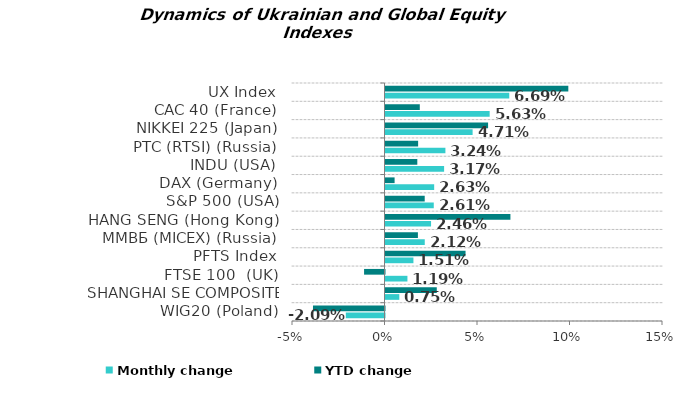
| Category | Monthly change | YTD change |
|---|---|---|
| WIG20 (Poland) | -0.021 | -0.039 |
| SHANGHAI SE COMPOSITE (China) | 0.007 | 0.028 |
| FTSE 100  (UK) | 0.012 | -0.011 |
| PFTS Index | 0.015 | 0.043 |
| ММВБ (MICEX) (Russia) | 0.021 | 0.018 |
| HANG SENG (Hong Kong) | 0.025 | 0.068 |
| S&P 500 (USA) | 0.026 | 0.021 |
| DAX (Germany) | 0.026 | 0.005 |
| INDU (USA) | 0.032 | 0.017 |
| РТС (RTSI) (Russia) | 0.032 | 0.018 |
| NIKKEI 225 (Japan) | 0.047 | 0.055 |
| CAC 40 (France) | 0.056 | 0.019 |
| UX Index | 0.067 | 0.099 |